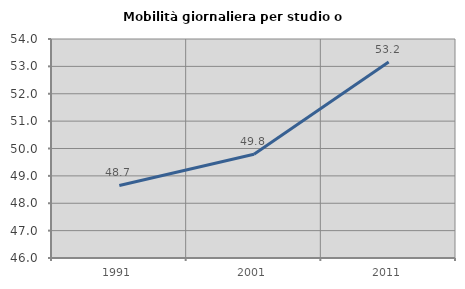
| Category | Mobilità giornaliera per studio o lavoro |
|---|---|
| 1991.0 | 48.65 |
| 2001.0 | 49.789 |
| 2011.0 | 53.161 |